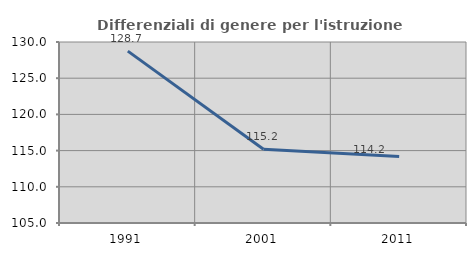
| Category | Differenziali di genere per l'istruzione superiore |
|---|---|
| 1991.0 | 128.736 |
| 2001.0 | 115.189 |
| 2011.0 | 114.173 |